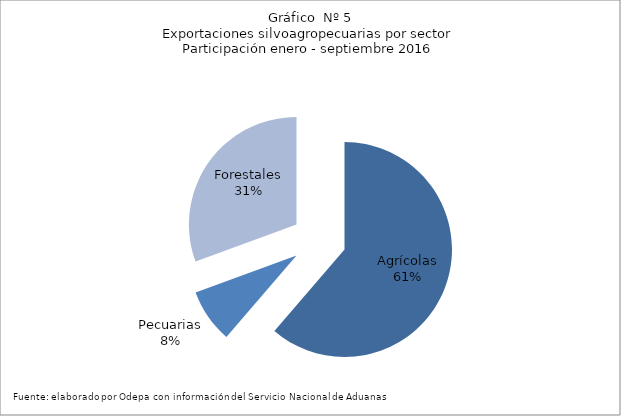
| Category | Series 0 |
|---|---|
| Agrícolas | 7058554 |
| Pecuarias | 931564 |
| Forestales | 3523441 |